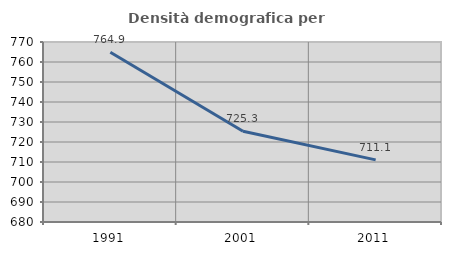
| Category | Densità demografica |
|---|---|
| 1991.0 | 764.889 |
| 2001.0 | 725.333 |
| 2011.0 | 711.052 |